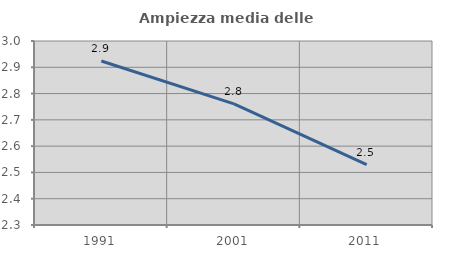
| Category | Ampiezza media delle famiglie |
|---|---|
| 1991.0 | 2.924 |
| 2001.0 | 2.761 |
| 2011.0 | 2.529 |